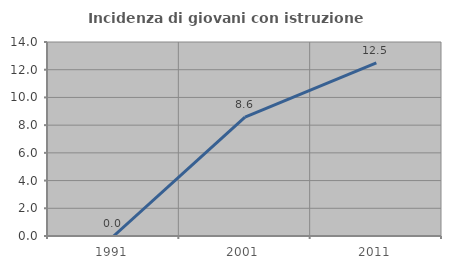
| Category | Incidenza di giovani con istruzione universitaria |
|---|---|
| 1991.0 | 0 |
| 2001.0 | 8.571 |
| 2011.0 | 12.5 |